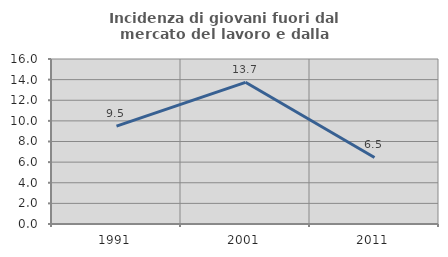
| Category | Incidenza di giovani fuori dal mercato del lavoro e dalla formazione  |
|---|---|
| 1991.0 | 9.497 |
| 2001.0 | 13.74 |
| 2011.0 | 6.452 |